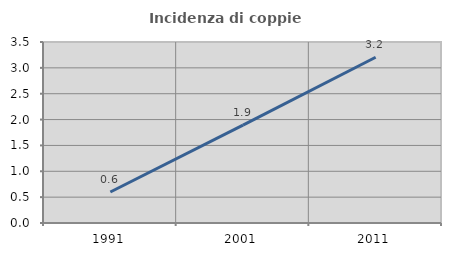
| Category | Incidenza di coppie miste |
|---|---|
| 1991.0 | 0.6 |
| 2001.0 | 1.892 |
| 2011.0 | 3.206 |